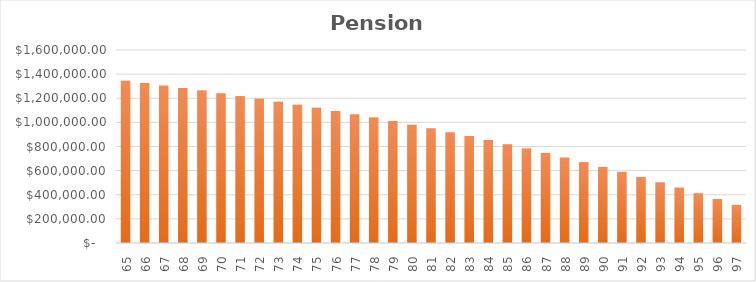
| Category | Balance |
|---|---|
| 65.0 | 1346017.557 |
| 66.0 | 1326398.084 |
| 67.0 | 1306190.026 |
| 68.0 | 1285375.727 |
| 69.0 | 1263936.999 |
| 70.0 | 1241855.109 |
| 71.0 | 1219110.762 |
| 72.0 | 1195684.085 |
| 73.0 | 1171554.608 |
| 74.0 | 1146701.246 |
| 75.0 | 1121102.283 |
| 76.0 | 1094735.352 |
| 77.0 | 1067577.412 |
| 78.0 | 1039604.735 |
| 79.0 | 1010792.877 |
| 80.0 | 981116.663 |
| 81.0 | 950550.163 |
| 82.0 | 919066.668 |
| 83.0 | 886638.668 |
| 84.0 | 853237.828 |
| 85.0 | 818834.963 |
| 86.0 | 783400.012 |
| 87.0 | 746902.012 |
| 88.0 | 709309.072 |
| 89.0 | 670588.345 |
| 90.0 | 630705.995 |
| 91.0 | 589627.175 |
| 92.0 | 547315.99 |
| 93.0 | 503735.47 |
| 94.0 | 458847.534 |
| 95.0 | 412612.96 |
| 96.0 | 364991.349 |
| 97.0 | 315941.089 |